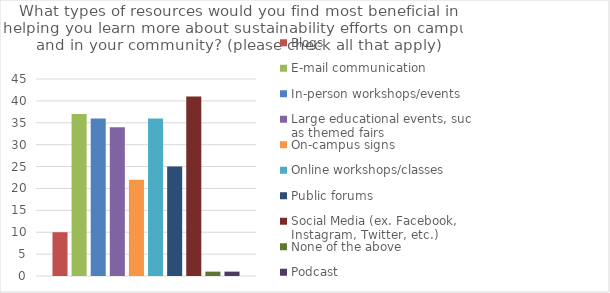
| Category | Blogs | E-mail communication | In-person workshops/events | Large educational events, such as themed fairs | On-campus signs | Online workshops/classes | Public forums | Social Media (ex. Facebook, Instagram, Twitter, etc.) | None of the above | Podcast |
|---|---|---|---|---|---|---|---|---|---|---|
| 0 | 10 | 37 | 36 | 34 | 22 | 36 | 25 | 41 | 1 | 1 |